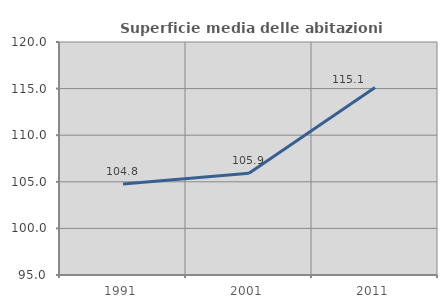
| Category | Superficie media delle abitazioni occupate |
|---|---|
| 1991.0 | 104.755 |
| 2001.0 | 105.912 |
| 2011.0 | 115.121 |